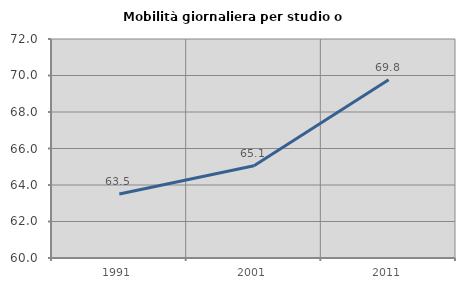
| Category | Mobilità giornaliera per studio o lavoro |
|---|---|
| 1991.0 | 63.51 |
| 2001.0 | 65.054 |
| 2011.0 | 69.772 |